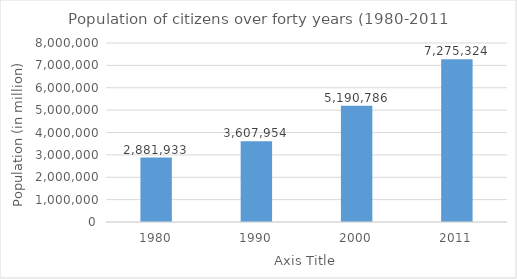
| Category | Series 0 |
|---|---|
| 1980.0 | 2881933 |
| 1990.0 | 3607954 |
| 2000.0 | 5190786 |
| 2011.0 | 7275324 |